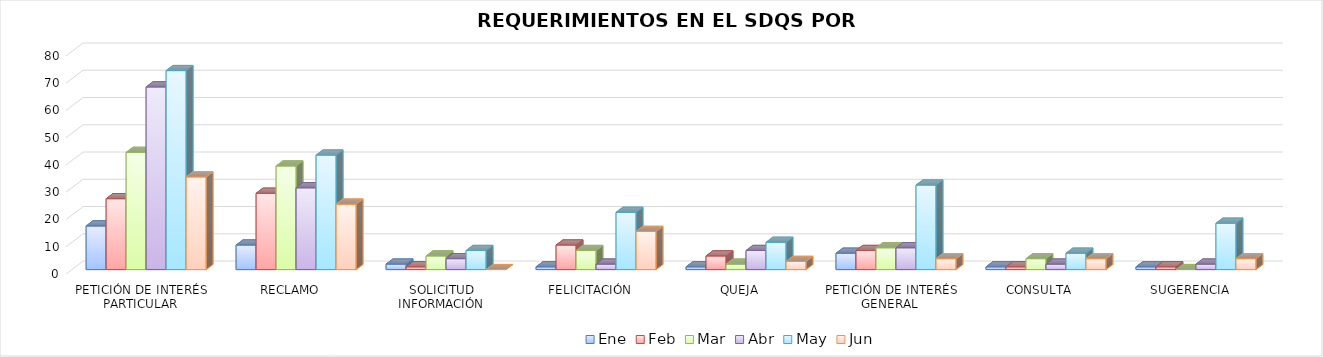
| Category | Ene | Feb | Mar | Abr | May | Jun |
|---|---|---|---|---|---|---|
| PETICIÓN DE INTERÉS PARTICULAR | 16 | 26 | 43 | 67 | 73 | 34 |
| RECLAMO | 9 | 28 | 38 | 30 | 42 | 24 |
| SOLICITUD INFORMACIÓN | 2 | 1 | 5 | 4 | 7 | 0 |
| FELICITACIÓN | 1 | 9 | 7 | 2 | 21 | 14 |
| QUEJA | 1 | 5 | 2 | 7 | 10 | 3 |
| PETICIÓN DE INTERÉS GENERAL  | 6 | 7 | 8 | 8 | 31 | 4 |
| CONSULTA | 1 | 1 | 4 | 2 | 6 | 4 |
| SUGERENCIA | 1 | 1 | 0 | 2 | 17 | 4 |